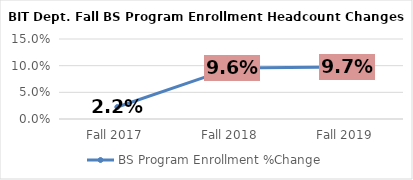
| Category | BS Program Enrollment %Change |
|---|---|
| Fall 2017 | 0.022 |
| Fall 2018 | 0.096 |
| Fall 2019 | 0.097 |